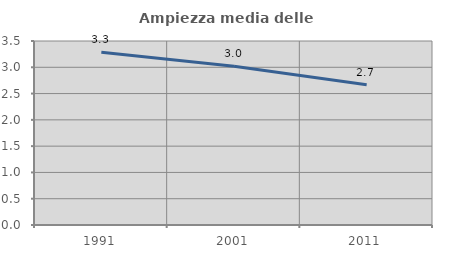
| Category | Ampiezza media delle famiglie |
|---|---|
| 1991.0 | 3.284 |
| 2001.0 | 3.021 |
| 2011.0 | 2.669 |